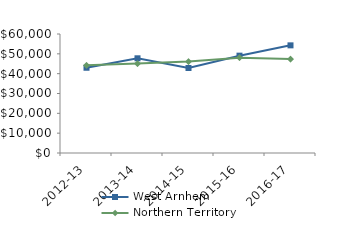
| Category | West Arnhem | Northern Territory |
|---|---|---|
| 2012-13 | 42981.43 | 44232.02 |
| 2013-14 | 47749.5 | 45075.51 |
| 2014-15 | 42846.02 | 46083.65 |
| 2015-16 | 49079 | 48046.27 |
| 2016-17 | 54277.04 | 47367.05 |